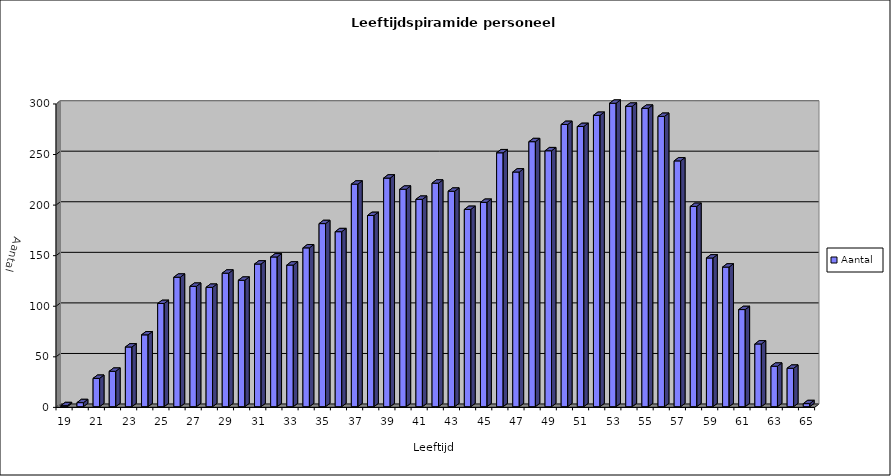
| Category | Aantal |
|---|---|
| 19.0 | 1 |
| 20.0 | 4 |
| 21.0 | 28 |
| 22.0 | 35 |
| 23.0 | 59 |
| 24.0 | 71 |
| 25.0 | 102 |
| 26.0 | 128 |
| 27.0 | 119 |
| 28.0 | 118 |
| 29.0 | 132 |
| 30.0 | 125 |
| 31.0 | 141 |
| 32.0 | 148 |
| 33.0 | 140 |
| 34.0 | 157 |
| 35.0 | 181 |
| 36.0 | 173 |
| 37.0 | 220 |
| 38.0 | 189 |
| 39.0 | 226 |
| 40.0 | 215 |
| 41.0 | 205 |
| 42.0 | 221 |
| 43.0 | 213 |
| 44.0 | 195 |
| 45.0 | 202 |
| 46.0 | 251 |
| 47.0 | 232 |
| 48.0 | 262 |
| 49.0 | 253 |
| 50.0 | 279 |
| 51.0 | 277 |
| 52.0 | 288 |
| 53.0 | 300 |
| 54.0 | 297 |
| 55.0 | 295 |
| 56.0 | 287 |
| 57.0 | 243 |
| 58.0 | 198 |
| 59.0 | 147 |
| 60.0 | 138 |
| 61.0 | 96 |
| 62.0 | 62 |
| 63.0 | 40 |
| 64.0 | 38 |
| 65.0 | 3 |